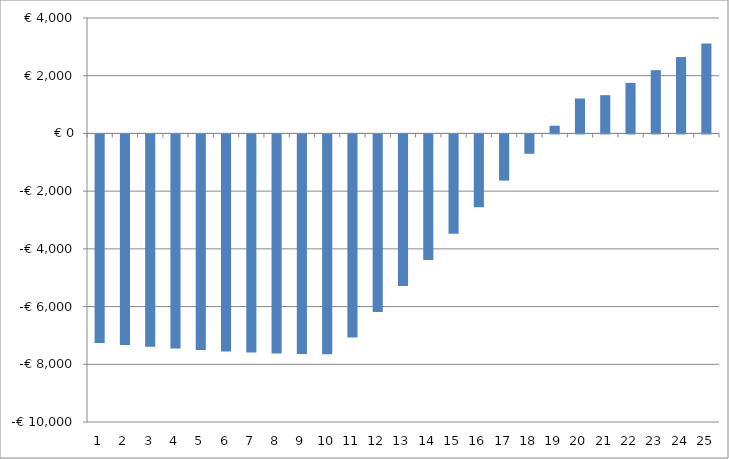
| Category | Series 0 |
|---|---|
| 0 | -6351.625 |
| 1 | -5540.847 |
| 2 | -4725.945 |
| 3 | -3906.161 |
| 4 | -3080.697 |
| 5 | -2248.713 |
| 6 | -1409.325 |
| 7 | -561.602 |
| 8 | 295.437 |
| 9 | 1162.824 |
| 10 | 1741.648 |
| 11 | 2633.055 |
| 12 | 3531.1 |
| 13 | 4434.749 |
| 14 | 5344.324 |
| 15 | 6260.158 |
| 16 | 7182.589 |
| 17 | 8111.962 |
| 18 | 9048.63 |
| 19 | 9992.952 |
| 20 | 10106.861 |
| 21 | 10534.014 |
| 22 | 10974.752 |
| 23 | 11429.422 |
| 24 | 11898.384 |